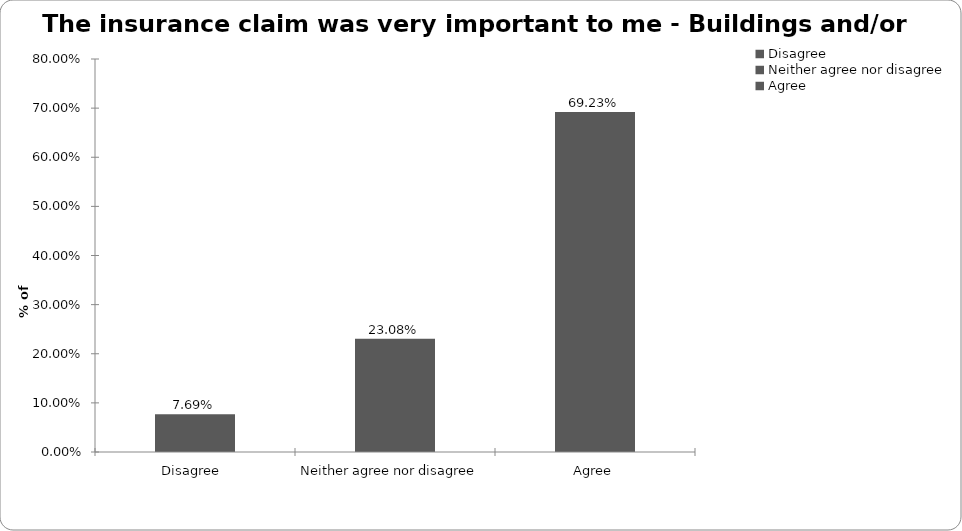
| Category | Buildings and/or conents |
|---|---|
| Disagree  | 0.077 |
| Neither agree nor disagree  | 0.231 |
| Agree | 0.692 |